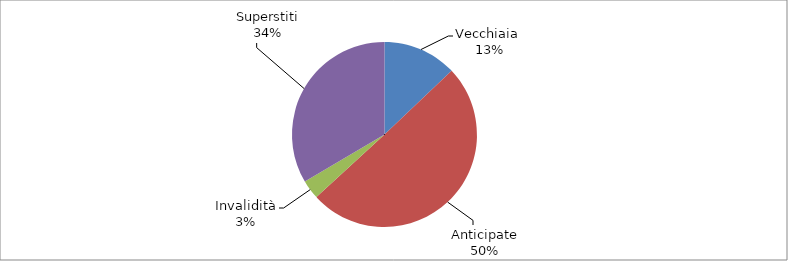
| Category | Series 0 |
|---|---|
| Vecchiaia  | 8221 |
| Anticipate | 31970 |
| Invalidità | 2136 |
| Superstiti | 21303 |